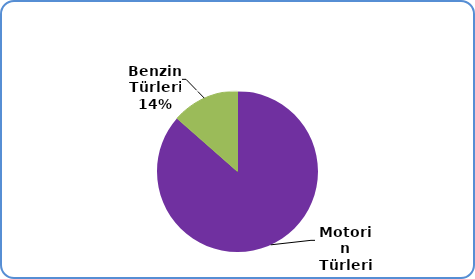
| Category | Series 0 |
|---|---|
| Motorin Türleri | 5379509997.024 |
| Benzin Türleri | 841603149.996 |